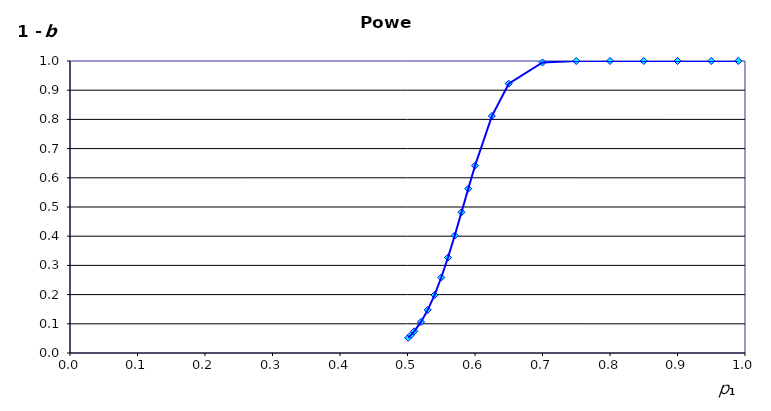
| Category | Power |
|---|---|
| 0.501 | 0.052 |
| 0.505 | 0.061 |
| 0.51 | 0.074 |
| 0.52 | 0.106 |
| 0.53 | 0.148 |
| 0.54 | 0.198 |
| 0.55 | 0.258 |
| 0.56 | 0.327 |
| 0.5700000000000001 | 0.402 |
| 0.58 | 0.482 |
| 0.59 | 0.563 |
| 0.6 | 0.641 |
| 0.625 | 0.811 |
| 0.65 | 0.922 |
| 0.7 | 0.995 |
| 0.75 | 1 |
| 0.8 | 1 |
| 0.85 | 1 |
| 0.9 | 1 |
| 0.95 | 1 |
| 0.99 | 1 |